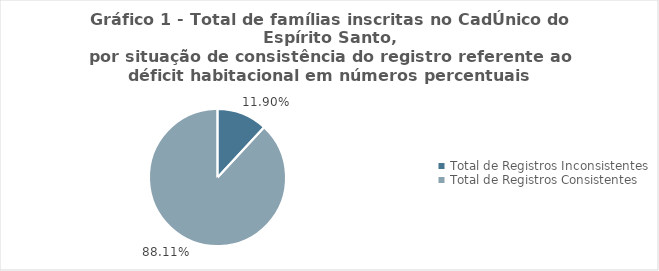
| Category | Series 0 |
|---|---|
| Total de Registros Inconsistentes | 0.119 |
| Total de Registros Consistentes | 0.881 |